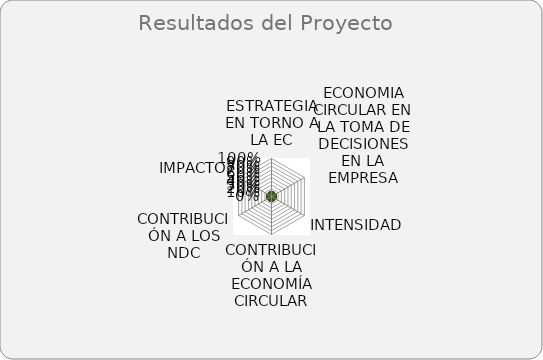
| Category | Series 0 |
|---|---|
| ESTRATEGIA EN TORNO A LA EC | 0 |
| ECONOMIA CIRCULAR EN LA TOMA DE DECISIONES EN LA EMPRESA | 0 |
| INTENSIDAD | 0 |
| CONTRIBUCIÓN A LA ECONOMÍA CIRCULAR | 0 |
| CONTRIBUCIÓN A LOS NDC | 0 |
| IMPACTO | 0 |